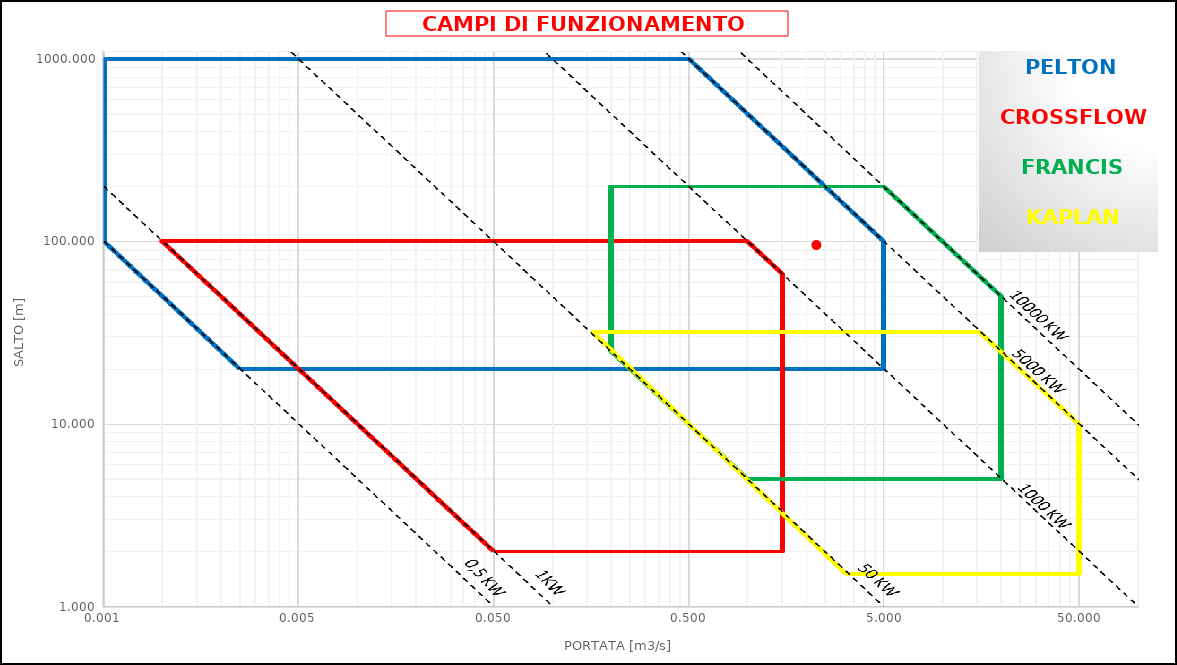
| Category | Series 0 |
|---|---|
| 2.23505 | 95.536 |